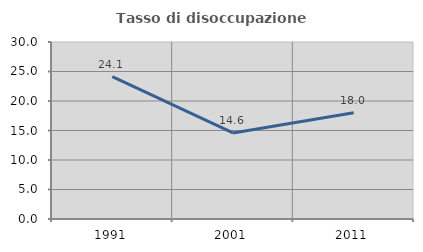
| Category | Tasso di disoccupazione giovanile  |
|---|---|
| 1991.0 | 24.138 |
| 2001.0 | 14.583 |
| 2011.0 | 18 |